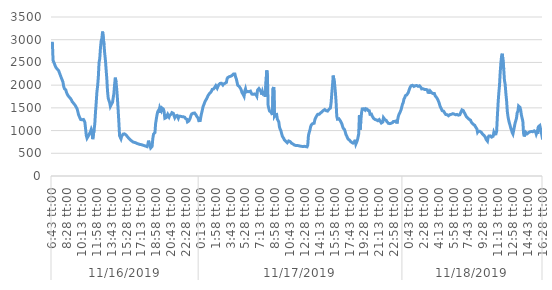
| Category | Series 0 |
|---|---|
| 0 | 2954.5 |
| 1 | 2548.3 |
| 2 | 2531.4 |
| 3 | 2467.6 |
| 4 | 2426.9 |
| 5 | 2390.5 |
| 6 | 2373.7 |
| 7 | 2351.6 |
| 8 | 2336 |
| 9 | 2317.9 |
| 10 | 2271.3 |
| 11 | 2255 |
| 12 | 2188.8 |
| 13 | 2148 |
| 14 | 2135.9 |
| 15 | 2068.2 |
| 16 | 1971.4 |
| 17 | 1924.6 |
| 18 | 1911.1 |
| 19 | 1895.4 |
| 20 | 1838.2 |
| 21 | 1823.3 |
| 22 | 1772.9 |
| 23 | 1751.6 |
| 24 | 1734.9 |
| 25 | 1715 |
| 26 | 1698.9 |
| 27 | 1670.8 |
| 28 | 1637.8 |
| 29 | 1622.6 |
| 30 | 1600.5 |
| 31 | 1582 |
| 32 | 1562.1 |
| 33 | 1540.7 |
| 34 | 1507 |
| 35 | 1476.4 |
| 36 | 1417.2 |
| 37 | 1351 |
| 38 | 1314 |
| 39 | 1274.7 |
| 40 | 1243.5 |
| 41 | 1241.8 |
| 42 | 1238.6 |
| 43 | 1244.2 |
| 44 | 1244.8 |
| 45 | 1219.1 |
| 46 | 1176.5 |
| 47 | 1034.3 |
| 48 | 890.8 |
| 49 | 831.9 |
| 50 | 848.8 |
| 51 | 885.2 |
| 52 | 916 |
| 53 | 949.3 |
| 54 | 979.6 |
| 55 | 1028.4 |
| 56 | 986 |
| 57 | 810.9 |
| 58 | 810 |
| 59 | 1013.7 |
| 60 | 1150.9 |
| 61 | 1412.1 |
| 62 | 1618.4 |
| 63 | 1854.8 |
| 64 | 1983.8 |
| 65 | 2179.9 |
| 66 | 2497.4 |
| 67 | 2585.4 |
| 68 | 2815.9 |
| 69 | 2976.4 |
| 70 | 3025.6 |
| 71 | 3178.9 |
| 72 | 3160.9 |
| 73 | 2887.4 |
| 74 | 2699.1 |
| 75 | 2549.2 |
| 76 | 2342.2 |
| 77 | 2138.2 |
| 78 | 1865.1 |
| 79 | 1707.5 |
| 80 | 1662.6 |
| 81 | 1617.8 |
| 82 | 1532.1 |
| 83 | 1551.7 |
| 84 | 1595.5 |
| 85 | 1620 |
| 86 | 1619.3 |
| 87 | 1818.7 |
| 88 | 2022.2 |
| 89 | 2164.8 |
| 90 | 2065.9 |
| 91 | 1914.8 |
| 92 | 1702.2 |
| 93 | 1452.6 |
| 94 | 1186.7 |
| 95 | 885.5 |
| 96 | 869.5 |
| 97 | 817.9 |
| 98 | 874.3 |
| 99 | 865.9 |
| 100 | 922.1 |
| 101 | 925.8 |
| 102 | 927.7 |
| 103 | 922.3 |
| 104 | 906.4 |
| 105 | 892.4 |
| 106 | 867.3 |
| 107 | 849.4 |
| 108 | 831.5 |
| 109 | 812 |
| 110 | 796.9 |
| 111 | 785.5 |
| 112 | 773.7 |
| 113 | 769 |
| 114 | 748.5 |
| 115 | 744.8 |
| 116 | 739.5 |
| 117 | 738.5 |
| 118 | 730.1 |
| 119 | 715.4 |
| 120 | 713.6 |
| 121 | 709.3 |
| 122 | 704.1 |
| 123 | 698.8 |
| 124 | 694.4 |
| 125 | 691.3 |
| 126 | 689.3 |
| 127 | 689.4 |
| 128 | 678.8 |
| 129 | 669.2 |
| 130 | 667.4 |
| 131 | 663.2 |
| 132 | 657.1 |
| 133 | 649.4 |
| 134 | 645.8 |
| 135 | 695.9 |
| 136 | 777.9 |
| 137 | 709.8 |
| 138 | 677.2 |
| 139 | 616.5 |
| 140 | 604.2 |
| 141 | 650.9 |
| 142 | 828 |
| 143 | 921.3 |
| 144 | 936 |
| 145 | 954.6 |
| 146 | 1161.6 |
| 147 | 1258.1 |
| 148 | 1351.2 |
| 149 | 1418 |
| 150 | 1443.6 |
| 151 | 1388.9 |
| 152 | 1504.9 |
| 153 | 1502.9 |
| 154 | 1439.6 |
| 155 | 1496.8 |
| 156 | 1504.7 |
| 157 | 1472.4 |
| 158 | 1413.3 |
| 159 | 1270.1 |
| 160 | 1286.2 |
| 161 | 1286 |
| 162 | 1328.6 |
| 163 | 1359.6 |
| 164 | 1327.6 |
| 165 | 1298.2 |
| 166 | 1337.2 |
| 167 | 1336.7 |
| 168 | 1360.9 |
| 169 | 1394 |
| 170 | 1377.7 |
| 171 | 1379.8 |
| 172 | 1327.2 |
| 173 | 1284.7 |
| 174 | 1316.5 |
| 175 | 1334.2 |
| 176 | 1330.9 |
| 177 | 1330.9 |
| 178 | 1271.1 |
| 179 | 1318.3 |
| 180 | 1318.9 |
| 181 | 1315.1 |
| 182 | 1303.3 |
| 183 | 1306.8 |
| 184 | 1309.4 |
| 185 | 1305.3 |
| 186 | 1298.7 |
| 187 | 1293.4 |
| 188 | 1267.1 |
| 189 | 1265.8 |
| 190 | 1251.8 |
| 191 | 1191.3 |
| 192 | 1172.3 |
| 193 | 1212.3 |
| 194 | 1242.4 |
| 195 | 1281.4 |
| 196 | 1337.9 |
| 197 | 1365.5 |
| 198 | 1368.9 |
| 199 | 1381.2 |
| 200 | 1399 |
| 201 | 1387.2 |
| 202 | 1382.9 |
| 203 | 1346.6 |
| 204 | 1316.6 |
| 205 | 1301.7 |
| 206 | 1272.1 |
| 207 | 1218.2 |
| 208 | 1196.3 |
| 209 | 1220.6 |
| 210 | 1314.3 |
| 211 | 1386.9 |
| 212 | 1450.5 |
| 213 | 1526.4 |
| 214 | 1564.1 |
| 215 | 1606.4 |
| 216 | 1647.6 |
| 217 | 1667.9 |
| 218 | 1697.9 |
| 219 | 1702.5 |
| 220 | 1767.7 |
| 221 | 1787.2 |
| 222 | 1813.9 |
| 223 | 1829.2 |
| 224 | 1845 |
| 225 | 1871.7 |
| 226 | 1907 |
| 227 | 1925.6 |
| 228 | 1916.9 |
| 229 | 1939.1 |
| 230 | 1932 |
| 231 | 1988.1 |
| 232 | 1989 |
| 233 | 1931.9 |
| 234 | 1933.3 |
| 235 | 2003.4 |
| 236 | 2005 |
| 237 | 2038.2 |
| 238 | 2036.3 |
| 239 | 2040.8 |
| 240 | 2048.4 |
| 241 | 2003.1 |
| 242 | 2026.3 |
| 243 | 2040.3 |
| 244 | 2040.6 |
| 245 | 2050.6 |
| 246 | 2060.3 |
| 247 | 2141.2 |
| 248 | 2167.8 |
| 249 | 2178 |
| 250 | 2185.2 |
| 251 | 2195.3 |
| 252 | 2195.2 |
| 253 | 2212.3 |
| 254 | 2211.5 |
| 255 | 2232.4 |
| 256 | 2246.6 |
| 257 | 2255 |
| 258 | 2245 |
| 259 | 2179.4 |
| 260 | 2138.7 |
| 261 | 2070.2 |
| 262 | 1998.8 |
| 263 | 1979.2 |
| 264 | 1971.7 |
| 265 | 1955.2 |
| 266 | 1926.2 |
| 267 | 1890 |
| 268 | 1837.9 |
| 269 | 1829 |
| 270 | 1787.7 |
| 271 | 1756.5 |
| 272 | 1868.6 |
| 273 | 1917.6 |
| 274 | 1849.2 |
| 275 | 1858.5 |
| 276 | 1861.2 |
| 277 | 1855.1 |
| 278 | 1856.1 |
| 279 | 1866.8 |
| 280 | 1868.3 |
| 281 | 1859.5 |
| 282 | 1802.3 |
| 283 | 1797.5 |
| 284 | 1798.3 |
| 285 | 1810.1 |
| 286 | 1806.6 |
| 287 | 1791.5 |
| 288 | 1784.9 |
| 289 | 1756.2 |
| 290 | 1889.7 |
| 291 | 1907.3 |
| 292 | 1925.2 |
| 293 | 1926.1 |
| 294 | 1880.9 |
| 295 | 1851.1 |
| 296 | 1791.8 |
| 297 | 1858.2 |
| 298 | 1807.7 |
| 299 | 1791.6 |
| 300 | 1827 |
| 301 | 1743 |
| 302 | 1732.3 |
| 303 | 2322.7 |
| 304 | 2208.4 |
| 305 | 1550 |
| 306 | 1484.9 |
| 307 | 1429.3 |
| 308 | 1433.3 |
| 309 | 1406.2 |
| 310 | 1380.2 |
| 311 | 1341.2 |
| 312 | 1926.4 |
| 313 | 1957.5 |
| 314 | 1319.6 |
| 315 | 1345.7 |
| 316 | 1359.6 |
| 317 | 1354.1 |
| 318 | 1253.9 |
| 319 | 1261.7 |
| 320 | 1194 |
| 321 | 1081.2 |
| 322 | 1028.4 |
| 323 | 1001 |
| 324 | 937 |
| 325 | 882.1 |
| 326 | 852.4 |
| 327 | 828.8 |
| 328 | 793.1 |
| 329 | 772.6 |
| 330 | 760.6 |
| 331 | 747.8 |
| 332 | 732.2 |
| 333 | 717.4 |
| 334 | 770.8 |
| 335 | 768.3 |
| 336 | 758.7 |
| 337 | 738.2 |
| 338 | 722.5 |
| 339 | 716.2 |
| 340 | 704.9 |
| 341 | 696.4 |
| 342 | 683.1 |
| 343 | 680.3 |
| 344 | 671.5 |
| 345 | 671.1 |
| 346 | 672.3 |
| 347 | 667.8 |
| 348 | 666.8 |
| 349 | 656.4 |
| 350 | 659.6 |
| 351 | 660 |
| 352 | 653.3 |
| 353 | 646.8 |
| 354 | 648.4 |
| 355 | 650.8 |
| 356 | 653.1 |
| 357 | 649.8 |
| 358 | 648.4 |
| 359 | 645.4 |
| 360 | 641.6 |
| 361 | 681.9 |
| 362 | 894.3 |
| 363 | 957.4 |
| 364 | 1007.3 |
| 365 | 1082.3 |
| 366 | 1122.7 |
| 367 | 1137.5 |
| 368 | 1153 |
| 369 | 1156.1 |
| 370 | 1161.3 |
| 371 | 1237.2 |
| 372 | 1276.7 |
| 373 | 1307.8 |
| 374 | 1306.4 |
| 375 | 1356.7 |
| 376 | 1357.2 |
| 377 | 1357.7 |
| 378 | 1373.2 |
| 379 | 1387.9 |
| 380 | 1401.4 |
| 381 | 1409.9 |
| 382 | 1420.8 |
| 383 | 1440.9 |
| 384 | 1450.5 |
| 385 | 1462.2 |
| 386 | 1453.1 |
| 387 | 1438.4 |
| 388 | 1443.9 |
| 389 | 1429 |
| 390 | 1448.2 |
| 391 | 1467.4 |
| 392 | 1477.6 |
| 393 | 1496.4 |
| 394 | 1613.9 |
| 395 | 1819.2 |
| 396 | 2001.8 |
| 397 | 2210.5 |
| 398 | 2203.2 |
| 399 | 2017.4 |
| 400 | 1853.8 |
| 401 | 1633.3 |
| 402 | 1316.1 |
| 403 | 1251.5 |
| 404 | 1238.7 |
| 405 | 1260.7 |
| 406 | 1241.6 |
| 407 | 1215.2 |
| 408 | 1203.4 |
| 409 | 1156.6 |
| 410 | 1103.9 |
| 411 | 1056.3 |
| 412 | 1048.9 |
| 413 | 1020.2 |
| 414 | 971.1 |
| 415 | 913.5 |
| 416 | 884 |
| 417 | 842.8 |
| 418 | 812.6 |
| 419 | 811.1 |
| 420 | 791.7 |
| 421 | 767.5 |
| 422 | 752.8 |
| 423 | 741.9 |
| 424 | 737.9 |
| 425 | 723.3 |
| 426 | 717.5 |
| 427 | 742.5 |
| 428 | 797.8 |
| 429 | 704.9 |
| 430 | 719 |
| 431 | 779.7 |
| 432 | 848.3 |
| 433 | 926.9 |
| 434 | 1340.6 |
| 435 | 1019.9 |
| 436 | 1209.9 |
| 437 | 1387.7 |
| 438 | 1477.2 |
| 439 | 1491 |
| 440 | 1479.5 |
| 441 | 1469.4 |
| 442 | 1450.8 |
| 443 | 1481.9 |
| 444 | 1485 |
| 445 | 1471.2 |
| 446 | 1444 |
| 447 | 1442.9 |
| 448 | 1436.8 |
| 449 | 1358.8 |
| 450 | 1363.2 |
| 451 | 1363.6 |
| 452 | 1322.9 |
| 453 | 1320.2 |
| 454 | 1268.5 |
| 455 | 1247.4 |
| 456 | 1245 |
| 457 | 1266.8 |
| 458 | 1235.3 |
| 459 | 1239.7 |
| 460 | 1216.8 |
| 461 | 1214.4 |
| 462 | 1241.9 |
| 463 | 1236.8 |
| 464 | 1191.6 |
| 465 | 1166.7 |
| 466 | 1181.4 |
| 467 | 1187.7 |
| 468 | 1285.1 |
| 469 | 1286.5 |
| 470 | 1241.7 |
| 471 | 1244.2 |
| 472 | 1223.4 |
| 473 | 1192.7 |
| 474 | 1187.6 |
| 475 | 1160 |
| 476 | 1157.3 |
| 477 | 1153.1 |
| 478 | 1161.2 |
| 479 | 1161.2 |
| 480 | 1167.4 |
| 481 | 1177 |
| 482 | 1199.2 |
| 483 | 1202.6 |
| 484 | 1202.6 |
| 485 | 1208.9 |
| 486 | 1212 |
| 487 | 1157 |
| 488 | 1235.3 |
| 489 | 1309 |
| 490 | 1359.7 |
| 491 | 1386.7 |
| 492 | 1423.3 |
| 493 | 1464.2 |
| 494 | 1526.9 |
| 495 | 1586.2 |
| 496 | 1617.8 |
| 497 | 1695.9 |
| 498 | 1718.3 |
| 499 | 1767.5 |
| 500 | 1787.1 |
| 501 | 1785.6 |
| 502 | 1800.6 |
| 503 | 1834.8 |
| 504 | 1878.4 |
| 505 | 1926.4 |
| 506 | 1960.2 |
| 507 | 1986.4 |
| 508 | 1992.8 |
| 509 | 1996.3 |
| 510 | 1990.9 |
| 511 | 1971.5 |
| 512 | 1968.8 |
| 513 | 1988.5 |
| 514 | 1987 |
| 515 | 1990.7 |
| 516 | 1982.9 |
| 517 | 1973.8 |
| 518 | 1962.8 |
| 519 | 1985.3 |
| 520 | 1968.7 |
| 521 | 1949.6 |
| 522 | 1917.6 |
| 523 | 1903.3 |
| 524 | 1919.8 |
| 525 | 1919.2 |
| 526 | 1905 |
| 527 | 1906.4 |
| 528 | 1904.7 |
| 529 | 1902.7 |
| 530 | 1895.8 |
| 531 | 1841.3 |
| 532 | 1823.2 |
| 533 | 1838.1 |
| 534 | 1872.2 |
| 535 | 1860.6 |
| 536 | 1835.6 |
| 537 | 1820.8 |
| 538 | 1814.2 |
| 539 | 1820.1 |
| 540 | 1815.1 |
| 541 | 1767 |
| 542 | 1760.6 |
| 543 | 1729.1 |
| 544 | 1705.6 |
| 545 | 1672 |
| 546 | 1637.4 |
| 547 | 1590.5 |
| 548 | 1538.3 |
| 549 | 1504.1 |
| 550 | 1488.2 |
| 551 | 1438.5 |
| 552 | 1442.6 |
| 553 | 1427 |
| 554 | 1406.2 |
| 555 | 1377.3 |
| 556 | 1354.5 |
| 557 | 1350.1 |
| 558 | 1349.5 |
| 559 | 1329.2 |
| 560 | 1325.6 |
| 561 | 1326.8 |
| 562 | 1351.8 |
| 563 | 1348 |
| 564 | 1357.9 |
| 565 | 1366.8 |
| 566 | 1371.8 |
| 567 | 1382.7 |
| 568 | 1362.3 |
| 569 | 1360.8 |
| 570 | 1347.3 |
| 571 | 1344.6 |
| 572 | 1355.3 |
| 573 | 1349.5 |
| 574 | 1339.3 |
| 575 | 1340.7 |
| 576 | 1348.8 |
| 577 | 1360.7 |
| 578 | 1426 |
| 579 | 1455.2 |
| 580 | 1460.4 |
| 581 | 1437.1 |
| 582 | 1400.8 |
| 583 | 1375.9 |
| 584 | 1343.3 |
| 585 | 1310.8 |
| 586 | 1290.8 |
| 587 | 1280.2 |
| 588 | 1260.1 |
| 589 | 1249.1 |
| 590 | 1243.6 |
| 591 | 1230.1 |
| 592 | 1191.8 |
| 593 | 1169 |
| 594 | 1149.5 |
| 595 | 1137.1 |
| 596 | 1126.4 |
| 597 | 1116.8 |
| 598 | 1086.6 |
| 599 | 1070.6 |
| 600 | 1037.5 |
| 601 | 963.6 |
| 602 | 987.4 |
| 603 | 987.6 |
| 604 | 983.5 |
| 605 | 984.4 |
| 606 | 967.5 |
| 607 | 958.5 |
| 608 | 923.4 |
| 609 | 915.1 |
| 610 | 896.7 |
| 611 | 883.7 |
| 612 | 852.4 |
| 613 | 806.4 |
| 614 | 786.7 |
| 615 | 767.1 |
| 616 | 852.9 |
| 617 | 880.4 |
| 618 | 878.8 |
| 619 | 883.4 |
| 620 | 880.3 |
| 621 | 855.8 |
| 622 | 873.1 |
| 623 | 875.1 |
| 624 | 959 |
| 625 | 920 |
| 626 | 920.5 |
| 627 | 927.1 |
| 628 | 988.5 |
| 629 | 1313.4 |
| 630 | 1596.9 |
| 631 | 1820.6 |
| 632 | 1988.4 |
| 633 | 2278.3 |
| 634 | 2494.2 |
| 635 | 2643.3 |
| 636 | 2691.8 |
| 637 | 2677.7 |
| 638 | 2356.9 |
| 639 | 2108.2 |
| 640 | 2019.7 |
| 641 | 1822.2 |
| 642 | 1665.5 |
| 643 | 1430 |
| 644 | 1309.3 |
| 645 | 1229.1 |
| 646 | 1165.4 |
| 647 | 1111.5 |
| 648 | 1051 |
| 649 | 1009.2 |
| 650 | 957.1 |
| 651 | 924.5 |
| 652 | 998.8 |
| 653 | 1001.1 |
| 654 | 1161.9 |
| 655 | 1157 |
| 656 | 1269.4 |
| 657 | 1390.8 |
| 658 | 1421.4 |
| 659 | 1540.3 |
| 660 | 1554 |
| 661 | 1511.2 |
| 662 | 1449.6 |
| 663 | 1340.8 |
| 664 | 1271.7 |
| 665 | 1206.9 |
| 666 | 942.6 |
| 667 | 870.3 |
| 668 | 922.5 |
| 669 | 962.9 |
| 670 | 959.1 |
| 671 | 928.3 |
| 672 | 924 |
| 673 | 954.5 |
| 674 | 954.9 |
| 675 | 972.9 |
| 676 | 974.9 |
| 677 | 980.3 |
| 678 | 981.2 |
| 679 | 974.5 |
| 680 | 984.1 |
| 681 | 994.2 |
| 682 | 995.4 |
| 683 | 971.9 |
| 684 | 920.3 |
| 685 | 961.2 |
| 686 | 926.7 |
| 687 | 1084.6 |
| 688 | 1091.5 |
| 689 | 1111 |
| 690 | 1106.3 |
| 691 | 970.8 |
| 692 | 888.8 |
| 693 | 802.2 |